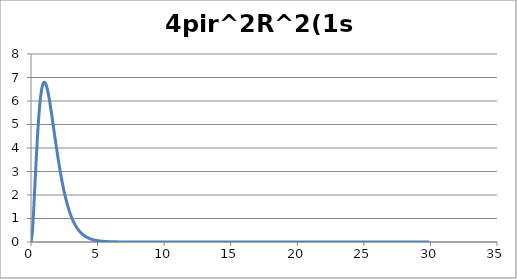
| Category | 4pir^2R^2(1s) |
|---|---|
| 0.0 | 0 |
| 0.1 | 0.412 |
| 0.2 | 1.348 |
| 0.30000000000000004 | 2.483 |
| 0.4 | 3.614 |
| 0.5 | 4.623 |
| 0.6 | 5.45 |
| 0.7 | 6.074 |
| 0.7999999999999999 | 6.495 |
| 0.8999999999999999 | 6.73 |
| 0.9999999999999999 | 6.802 |
| 1.0999999999999999 | 6.739 |
| 1.2 | 6.566 |
| 1.3 | 6.309 |
| 1.4000000000000001 | 5.991 |
| 1.5000000000000002 | 5.631 |
| 1.6000000000000003 | 5.245 |
| 1.7000000000000004 | 4.848 |
| 1.8000000000000005 | 4.45 |
| 1.9000000000000006 | 4.059 |
| 2.0000000000000004 | 3.682 |
| 2.1000000000000005 | 3.324 |
| 2.2000000000000006 | 2.987 |
| 2.3000000000000007 | 2.673 |
| 2.400000000000001 | 2.383 |
| 2.500000000000001 | 2.117 |
| 2.600000000000001 | 1.874 |
| 2.700000000000001 | 1.655 |
| 2.800000000000001 | 1.457 |
| 2.9000000000000012 | 1.28 |
| 3.0000000000000013 | 1.121 |
| 3.1000000000000014 | 0.98 |
| 3.2000000000000015 | 0.855 |
| 3.3000000000000016 | 0.745 |
| 3.4000000000000017 | 0.647 |
| 3.5000000000000018 | 0.561 |
| 3.600000000000002 | 0.486 |
| 3.700000000000002 | 0.421 |
| 3.800000000000002 | 0.363 |
| 3.900000000000002 | 0.313 |
| 4.000000000000002 | 0.27 |
| 4.100000000000001 | 0.232 |
| 4.200000000000001 | 0.199 |
| 4.300000000000001 | 0.171 |
| 4.4 | 0.147 |
| 4.5 | 0.126 |
| 4.6 | 0.107 |
| 4.699999999999999 | 0.092 |
| 4.799999999999999 | 0.078 |
| 4.899999999999999 | 0.067 |
| 4.999999999999998 | 0.057 |
| 5.099999999999998 | 0.049 |
| 5.1999999999999975 | 0.041 |
| 5.299999999999997 | 0.035 |
| 5.399999999999997 | 0.03 |
| 5.4999999999999964 | 0.025 |
| 5.599999999999996 | 0.022 |
| 5.699999999999996 | 0.018 |
| 5.799999999999995 | 0.015 |
| 5.899999999999995 | 0.013 |
| 5.999999999999995 | 0.011 |
| 6.099999999999994 | 0.009 |
| 6.199999999999994 | 0.008 |
| 6.299999999999994 | 0.007 |
| 6.399999999999993 | 0.006 |
| 6.499999999999993 | 0.005 |
| 6.5999999999999925 | 0.004 |
| 6.699999999999992 | 0.003 |
| 6.799999999999992 | 0.003 |
| 6.8999999999999915 | 0.002 |
| 6.999999999999991 | 0.002 |
| 7.099999999999991 | 0.002 |
| 7.19999999999999 | 0.001 |
| 7.29999999999999 | 0.001 |
| 7.39999999999999 | 0.001 |
| 7.499999999999989 | 0.001 |
| 7.599999999999989 | 0.001 |
| 7.699999999999989 | 0.001 |
| 7.799999999999988 | 0.001 |
| 7.899999999999988 | 0 |
| 7.999999999999988 | 0 |
| 8.099999999999987 | 0 |
| 8.199999999999987 | 0 |
| 8.299999999999986 | 0 |
| 8.399999999999986 | 0 |
| 8.499999999999986 | 0 |
| 8.599999999999985 | 0 |
| 8.699999999999985 | 0 |
| 8.799999999999985 | 0 |
| 8.899999999999984 | 0 |
| 8.999999999999984 | 0 |
| 9.099999999999984 | 0 |
| 9.199999999999983 | 0 |
| 9.299999999999983 | 0 |
| 9.399999999999983 | 0 |
| 9.499999999999982 | 0 |
| 9.599999999999982 | 0 |
| 9.699999999999982 | 0 |
| 9.799999999999981 | 0 |
| 9.89999999999998 | 0 |
| 9.99999999999998 | 0 |
| 10.09999999999998 | 0 |
| 10.19999999999998 | 0 |
| 10.29999999999998 | 0 |
| 10.399999999999979 | 0 |
| 10.499999999999979 | 0 |
| 10.599999999999978 | 0 |
| 10.699999999999978 | 0 |
| 10.799999999999978 | 0 |
| 10.899999999999977 | 0 |
| 10.999999999999977 | 0 |
| 11.099999999999977 | 0 |
| 11.199999999999976 | 0 |
| 11.299999999999976 | 0 |
| 11.399999999999975 | 0 |
| 11.499999999999975 | 0 |
| 11.599999999999975 | 0 |
| 11.699999999999974 | 0 |
| 11.799999999999974 | 0 |
| 11.899999999999974 | 0 |
| 11.999999999999973 | 0 |
| 12.099999999999973 | 0 |
| 12.199999999999973 | 0 |
| 12.299999999999972 | 0 |
| 12.399999999999972 | 0 |
| 12.499999999999972 | 0 |
| 12.599999999999971 | 0 |
| 12.69999999999997 | 0 |
| 12.79999999999997 | 0 |
| 12.89999999999997 | 0 |
| 12.99999999999997 | 0 |
| 13.09999999999997 | 0 |
| 13.199999999999969 | 0 |
| 13.299999999999969 | 0 |
| 13.399999999999968 | 0 |
| 13.499999999999968 | 0 |
| 13.599999999999968 | 0 |
| 13.699999999999967 | 0 |
| 13.799999999999967 | 0 |
| 13.899999999999967 | 0 |
| 13.999999999999966 | 0 |
| 14.099999999999966 | 0 |
| 14.199999999999966 | 0 |
| 14.299999999999965 | 0 |
| 14.399999999999965 | 0 |
| 14.499999999999964 | 0 |
| 14.599999999999964 | 0 |
| 14.699999999999964 | 0 |
| 14.799999999999963 | 0 |
| 14.899999999999963 | 0 |
| 14.999999999999963 | 0 |
| 15.099999999999962 | 0 |
| 15.199999999999962 | 0 |
| 15.299999999999962 | 0 |
| 15.399999999999961 | 0 |
| 15.499999999999961 | 0 |
| 15.59999999999996 | 0 |
| 15.69999999999996 | 0 |
| 15.79999999999996 | 0 |
| 15.89999999999996 | 0 |
| 15.99999999999996 | 0 |
| 16.09999999999996 | 0 |
| 16.19999999999996 | 0 |
| 16.29999999999996 | 0 |
| 16.399999999999963 | 0 |
| 16.499999999999964 | 0 |
| 16.599999999999966 | 0 |
| 16.699999999999967 | 0 |
| 16.79999999999997 | 0 |
| 16.89999999999997 | 0 |
| 16.99999999999997 | 0 |
| 17.099999999999973 | 0 |
| 17.199999999999974 | 0 |
| 17.299999999999976 | 0 |
| 17.399999999999977 | 0 |
| 17.49999999999998 | 0 |
| 17.59999999999998 | 0 |
| 17.69999999999998 | 0 |
| 17.799999999999983 | 0 |
| 17.899999999999984 | 0 |
| 17.999999999999986 | 0 |
| 18.099999999999987 | 0 |
| 18.19999999999999 | 0 |
| 18.29999999999999 | 0 |
| 18.39999999999999 | 0 |
| 18.499999999999993 | 0 |
| 18.599999999999994 | 0 |
| 18.699999999999996 | 0 |
| 18.799999999999997 | 0 |
| 18.9 | 0 |
| 19.0 | 0 |
| 19.1 | 0 |
| 19.200000000000003 | 0 |
| 19.300000000000004 | 0 |
| 19.400000000000006 | 0 |
| 19.500000000000007 | 0 |
| 19.60000000000001 | 0 |
| 19.70000000000001 | 0 |
| 19.80000000000001 | 0 |
| 19.900000000000013 | 0 |
| 20.000000000000014 | 0 |
| 20.100000000000016 | 0 |
| 20.200000000000017 | 0 |
| 20.30000000000002 | 0 |
| 20.40000000000002 | 0 |
| 20.50000000000002 | 0 |
| 20.600000000000023 | 0 |
| 20.700000000000024 | 0 |
| 20.800000000000026 | 0 |
| 20.900000000000027 | 0 |
| 21.00000000000003 | 0 |
| 21.10000000000003 | 0 |
| 21.20000000000003 | 0 |
| 21.300000000000033 | 0 |
| 21.400000000000034 | 0 |
| 21.500000000000036 | 0 |
| 21.600000000000037 | 0 |
| 21.70000000000004 | 0 |
| 21.80000000000004 | 0 |
| 21.90000000000004 | 0 |
| 22.000000000000043 | 0 |
| 22.100000000000044 | 0 |
| 22.200000000000045 | 0 |
| 22.300000000000047 | 0 |
| 22.40000000000005 | 0 |
| 22.50000000000005 | 0 |
| 22.60000000000005 | 0 |
| 22.700000000000053 | 0 |
| 22.800000000000054 | 0 |
| 22.900000000000055 | 0 |
| 23.000000000000057 | 0 |
| 23.10000000000006 | 0 |
| 23.20000000000006 | 0 |
| 23.30000000000006 | 0 |
| 23.400000000000063 | 0 |
| 23.500000000000064 | 0 |
| 23.600000000000065 | 0 |
| 23.700000000000067 | 0 |
| 23.800000000000068 | 0 |
| 23.90000000000007 | 0 |
| 24.00000000000007 | 0 |
| 24.100000000000072 | 0 |
| 24.200000000000074 | 0 |
| 24.300000000000075 | 0 |
| 24.400000000000077 | 0 |
| 24.500000000000078 | 0 |
| 24.60000000000008 | 0 |
| 24.70000000000008 | 0 |
| 24.800000000000082 | 0 |
| 24.900000000000084 | 0 |
| 25.000000000000085 | 0 |
| 25.100000000000087 | 0 |
| 25.200000000000088 | 0 |
| 25.30000000000009 | 0 |
| 25.40000000000009 | 0 |
| 25.500000000000092 | 0 |
| 25.600000000000094 | 0 |
| 25.700000000000095 | 0 |
| 25.800000000000097 | 0 |
| 25.900000000000098 | 0 |
| 26.0000000000001 | 0 |
| 26.1000000000001 | 0 |
| 26.200000000000102 | 0 |
| 26.300000000000104 | 0 |
| 26.400000000000105 | 0 |
| 26.500000000000107 | 0 |
| 26.600000000000108 | 0 |
| 26.70000000000011 | 0 |
| 26.80000000000011 | 0 |
| 26.900000000000112 | 0 |
| 27.000000000000114 | 0 |
| 27.100000000000115 | 0 |
| 27.200000000000117 | 0 |
| 27.300000000000118 | 0 |
| 27.40000000000012 | 0 |
| 27.50000000000012 | 0 |
| 27.600000000000122 | 0 |
| 27.700000000000124 | 0 |
| 27.800000000000125 | 0 |
| 27.900000000000126 | 0 |
| 28.000000000000128 | 0 |
| 28.10000000000013 | 0 |
| 28.20000000000013 | 0 |
| 28.300000000000132 | 0 |
| 28.400000000000134 | 0 |
| 28.500000000000135 | 0 |
| 28.600000000000136 | 0 |
| 28.700000000000138 | 0 |
| 28.80000000000014 | 0 |
| 28.90000000000014 | 0 |
| 29.000000000000142 | 0 |
| 29.100000000000144 | 0 |
| 29.200000000000145 | 0 |
| 29.300000000000146 | 0 |
| 29.400000000000148 | 0 |
| 29.50000000000015 | 0 |
| 29.60000000000015 | 0 |
| 29.700000000000152 | 0 |
| 29.800000000000153 | 0 |
| 29.900000000000155 | 0 |